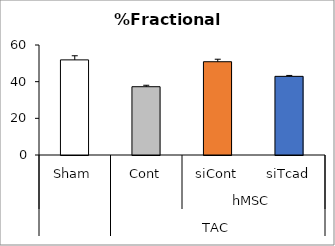
| Category | Series 0 |
|---|---|
| 0 | 51.878 |
| 1 | 37.246 |
| 2 | 50.879 |
| 3 | 42.895 |